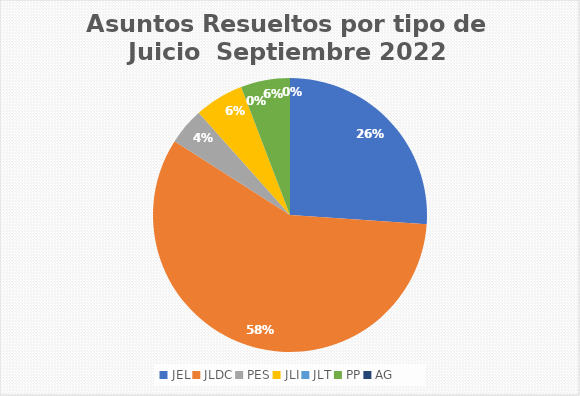
| Category | Asuntos Resueltos por tipo de Juicio  Septiembre |
|---|---|
| JEL | 18 |
| JLDC | 40 |
| PES | 3 |
| JLI | 4 |
| JLT | 0 |
| PP | 4 |
| AG | 0 |